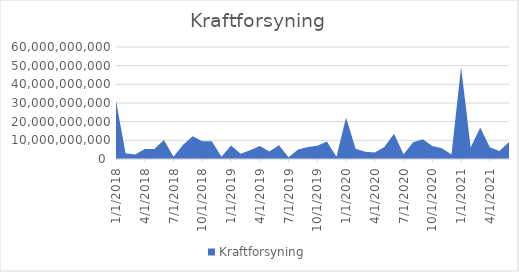
| Category | Kraftforsyning |
|---|---|
| 1/1/18 | 31231510000 |
| 2/1/18 | 3064000000 |
| 3/1/18 | 2385460000 |
| 4/1/18 | 5400980000 |
| 5/1/18 | 5325350000 |
| 6/1/18 | 10141100000 |
| 7/1/18 | 1175600000 |
| 8/1/18 | 7592137000 |
| 9/1/18 | 12238050000 |
| 10/1/18 | 9497039000 |
| 11/1/18 | 9444050000 |
| 12/1/18 | 1242780000 |
| 1/1/19 | 7181260000 |
| 2/1/19 | 2850100000 |
| 3/1/19 | 4747900000 |
| 4/1/19 | 6914720000 |
| 5/1/19 | 4041230000 |
| 6/1/19 | 7399171000 |
| 7/1/19 | 988250000 |
| 8/1/19 | 5050250000 |
| 9/1/19 | 6403800000 |
| 10/1/19 | 7113550000 |
| 11/1/19 | 9407700000 |
| 12/1/19 | 1225150000 |
| 1/1/20 | 22276575000 |
| 2/1/20 | 5441250000 |
| 3/1/20 | 3947115000 |
| 4/1/20 | 3533680000 |
| 5/1/20 | 6362750000 |
| 6/1/20 | 13525475000 |
| 7/1/20 | 2592460000 |
| 8/1/20 | 8983190000 |
| 9/1/20 | 10635545000 |
| 10/1/20 | 7019500000 |
| 11/1/20 | 5698670000 |
| 12/1/20 | 2450930000 |
| 1/1/21 | 49306430000 |
| 2/1/21 | 6107700000 |
| 3/1/21 | 16818450000 |
| 4/1/21 | 6338550000 |
| 5/1/21 | 4277700000 |
| 6/1/21 | 9159310000 |